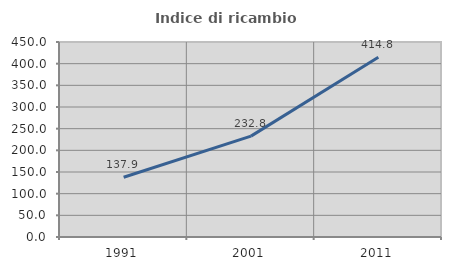
| Category | Indice di ricambio occupazionale  |
|---|---|
| 1991.0 | 137.931 |
| 2001.0 | 232.812 |
| 2011.0 | 414.815 |